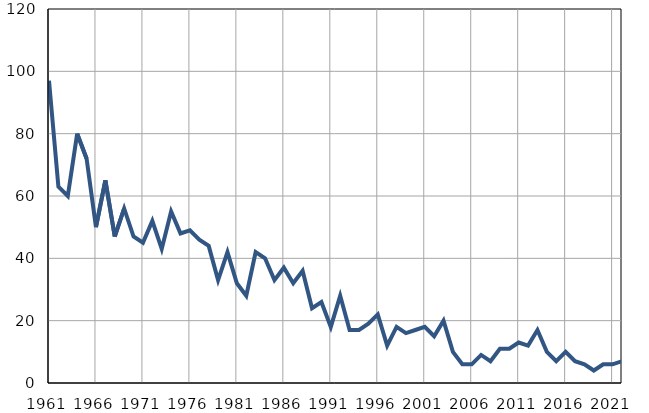
| Category | Умрла 
одојчад |
|---|---|
| 1961.0 | 97 |
| 1962.0 | 63 |
| 1963.0 | 60 |
| 1964.0 | 80 |
| 1965.0 | 72 |
| 1966.0 | 50 |
| 1967.0 | 65 |
| 1968.0 | 47 |
| 1969.0 | 56 |
| 1970.0 | 47 |
| 1971.0 | 45 |
| 1972.0 | 52 |
| 1973.0 | 43 |
| 1974.0 | 55 |
| 1975.0 | 48 |
| 1976.0 | 49 |
| 1977.0 | 46 |
| 1978.0 | 44 |
| 1979.0 | 33 |
| 1980.0 | 42 |
| 1981.0 | 32 |
| 1982.0 | 28 |
| 1983.0 | 42 |
| 1984.0 | 40 |
| 1985.0 | 33 |
| 1986.0 | 37 |
| 1987.0 | 32 |
| 1988.0 | 36 |
| 1989.0 | 24 |
| 1990.0 | 26 |
| 1991.0 | 18 |
| 1992.0 | 28 |
| 1993.0 | 17 |
| 1994.0 | 17 |
| 1995.0 | 19 |
| 1996.0 | 22 |
| 1997.0 | 12 |
| 1998.0 | 18 |
| 1999.0 | 16 |
| 2000.0 | 17 |
| 2001.0 | 18 |
| 2002.0 | 15 |
| 2003.0 | 20 |
| 2004.0 | 10 |
| 2005.0 | 6 |
| 2006.0 | 6 |
| 2007.0 | 9 |
| 2008.0 | 7 |
| 2009.0 | 11 |
| 2010.0 | 11 |
| 2011.0 | 13 |
| 2012.0 | 12 |
| 2013.0 | 17 |
| 2014.0 | 10 |
| 2015.0 | 7 |
| 2016.0 | 10 |
| 2017.0 | 7 |
| 2018.0 | 6 |
| 2019.0 | 4 |
| 2020.0 | 6 |
| 2021.0 | 6 |
| 2022.0 | 7 |